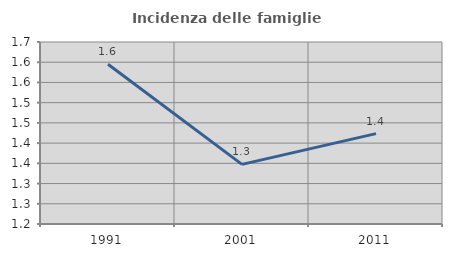
| Category | Incidenza delle famiglie numerose |
|---|---|
| 1991.0 | 1.595 |
| 2001.0 | 1.347 |
| 2011.0 | 1.423 |